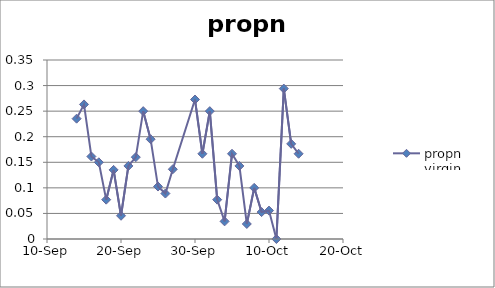
| Category | propn virgin |
|---|---|
| 38244.0 | 0.235 |
| 38245.0 | 0.263 |
| 38246.0 | 0.161 |
| 38247.0 | 0.15 |
| 38248.0 | 0.077 |
| 38249.0 | 0.135 |
| 38250.0 | 0.045 |
| 38251.0 | 0.143 |
| 38252.0 | 0.16 |
| 38253.0 | 0.25 |
| 38254.0 | 0.195 |
| 38255.0 | 0.103 |
| 38256.0 | 0.089 |
| 38257.0 | 0.136 |
| 38260.0 | 0.273 |
| 38261.0 | 0.167 |
| 38262.0 | 0.25 |
| 38263.0 | 0.077 |
| 38264.0 | 0.034 |
| 38265.0 | 0.167 |
| 38266.0 | 0.143 |
| 38267.0 | 0.029 |
| 38268.0 | 0.1 |
| 38269.0 | 0.053 |
| 38270.0 | 0.056 |
| 38271.0 | 0 |
| 38272.0 | 0.294 |
| 38273.0 | 0.186 |
| 38274.0 | 0.167 |